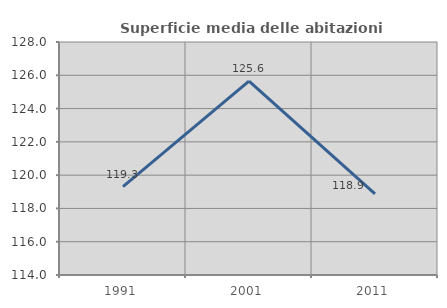
| Category | Superficie media delle abitazioni occupate |
|---|---|
| 1991.0 | 119.313 |
| 2001.0 | 125.644 |
| 2011.0 | 118.87 |